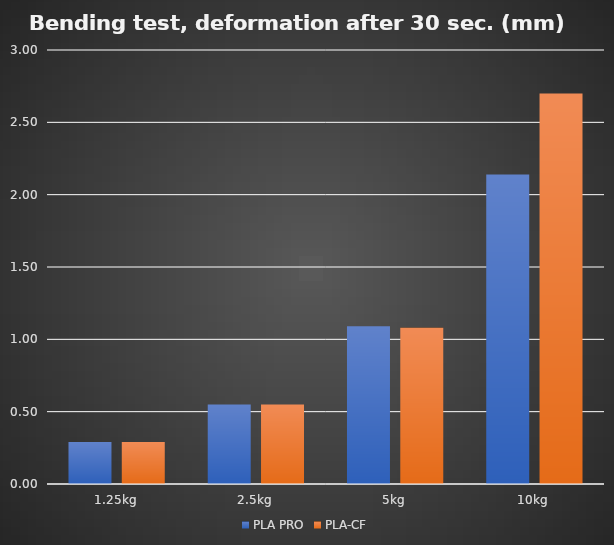
| Category | PLA PRO | PLA-CF |
|---|---|---|
| 1.25kg | 0.29 | 0.29 |
| 2.5kg | 0.55 | 0.55 |
| 5kg | 1.09 | 1.08 |
| 10kg | 2.14 | 2.7 |